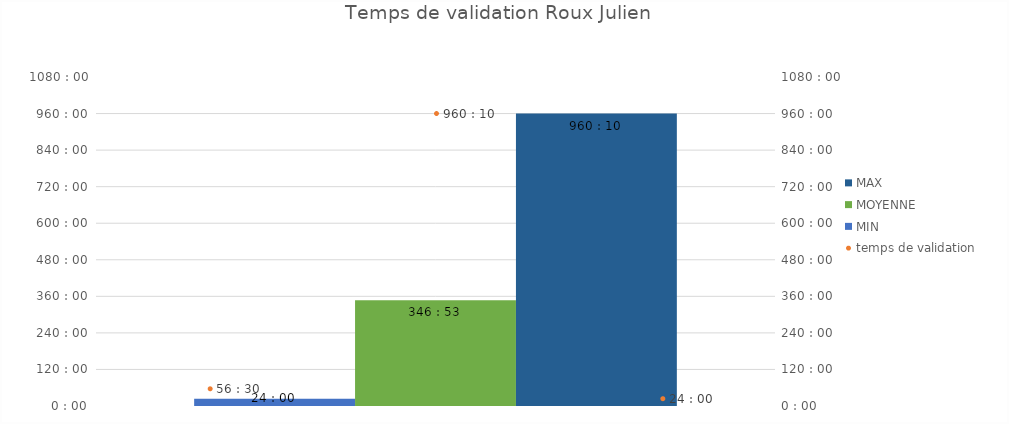
| Category | MIN  | MOYENNE | MAX |
|---|---|---|---|
| Roux Julien  | 1900-01-01 | 1900-01-14 10:53:20 | 1900-02-09 00:10:00 |